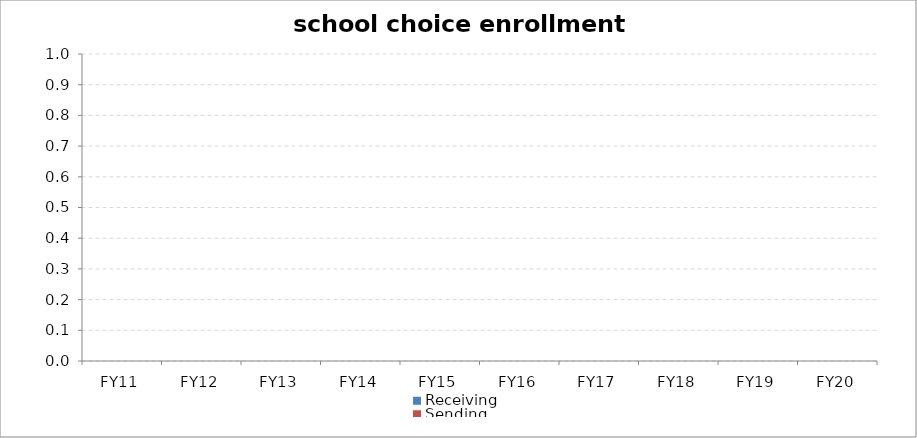
| Category | Receiving | Sending |
|---|---|---|
| FY11 | 0 | 0 |
| FY12 | 0 | 0 |
| FY13 | 0 | 0 |
| FY14 | 0 | 0 |
| FY15 | 0 | 0 |
| FY16 | 0 | 0 |
| FY17 | 0 | 0 |
| FY18 | 0 | 0 |
| FY19 | 0 | 0 |
| FY20 | 0 | 0 |